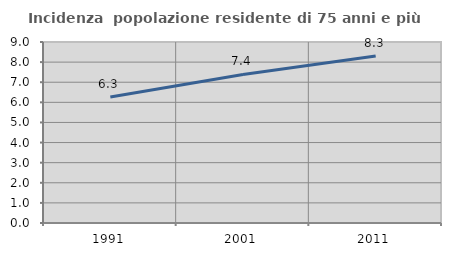
| Category | Incidenza  popolazione residente di 75 anni e più |
|---|---|
| 1991.0 | 6.267 |
| 2001.0 | 7.388 |
| 2011.0 | 8.302 |